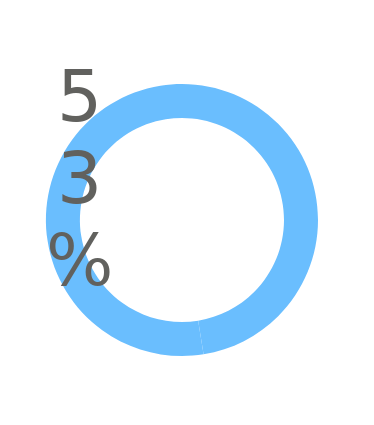
| Category | Series 0 |
|---|---|
| 0 | 0.475 |
| 1 | 0.525 |